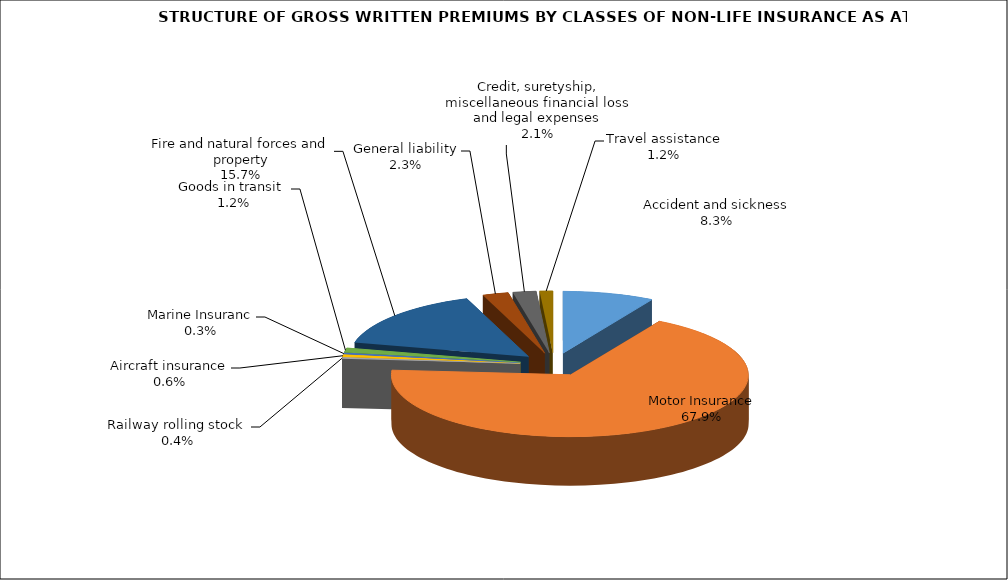
| Category | Accident and sickness |
|---|---|
| Accident and sickness | 0.083 |
| Motor Insurance | 0.679 |
| Railway rolling stock  | 0.004 |
| Aircraft insurance | 0.006 |
| Marine Insuranc | 0.003 |
| Goods in transit  | 0.012 |
| Fire and natural forces and property | 0.157 |
| General liability | 0.023 |
| Credit, suretyship, miscellaneous financial loss and legal expenses | 0.021 |
| Travel assistance | 0.012 |